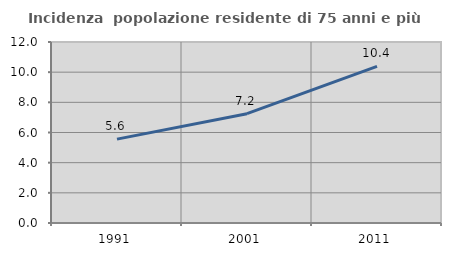
| Category | Incidenza  popolazione residente di 75 anni e più |
|---|---|
| 1991.0 | 5.562 |
| 2001.0 | 7.247 |
| 2011.0 | 10.386 |